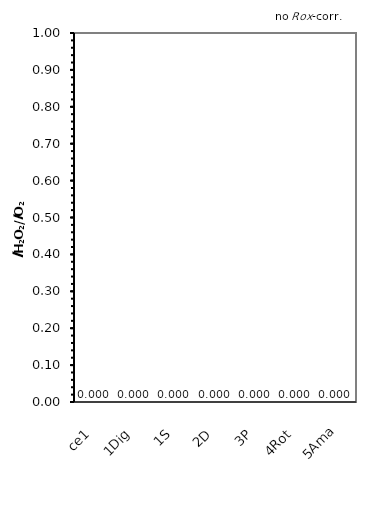
| Category | no ROX-corr. |
|---|---|
| ce1 | 0 |
| 1Dig | 0 |
| 1S | 0 |
| 2D | 0 |
| 3P | 0 |
| 4Rot | 0 |
| 5Ama | 0 |